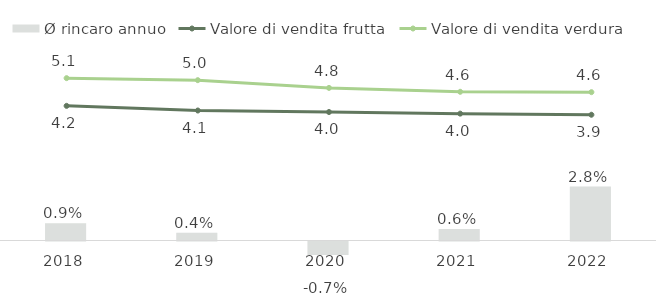
| Category | Ø rincaro annuo |
|---|---|
| 2018.0 | 0.009 |
| 2019.0 | 0.004 |
| 2020.0 | -0.007 |
| 2021.0 | 0.006 |
| 2022.0 | 0.028 |